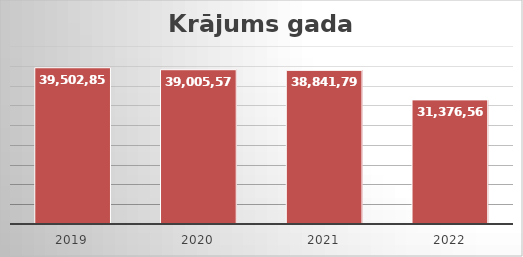
| Category | Series 0 |
|---|---|
| 2019.0 | 39502852 |
| 2020.0 | 39005576 |
| 2021.0 | 38841791 |
| 2022.0 | 31376561 |